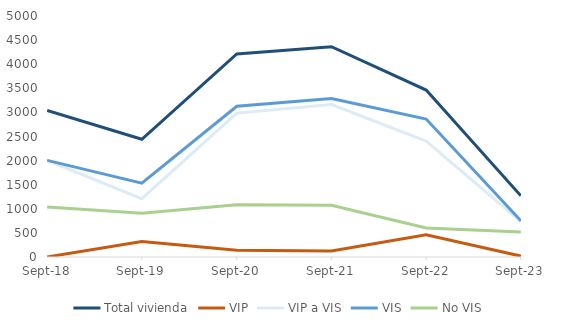
| Category | Total vivienda | VIP | VIP a VIS | VIS | No VIS |
|---|---|---|---|---|---|
| 2018-09-01 | 3040 | 0 | 2005 | 2005 | 1035 |
| 2019-09-01 | 2442 | 323 | 1210 | 1533 | 909 |
| 2020-09-01 | 4212 | 141 | 2985 | 3126 | 1086 |
| 2021-09-01 | 4364 | 126 | 3164 | 3290 | 1074 |
| 2022-09-01 | 3463 | 459 | 2404 | 2863 | 600 |
| 2023-09-01 | 1271 | 18 | 732 | 750 | 521 |